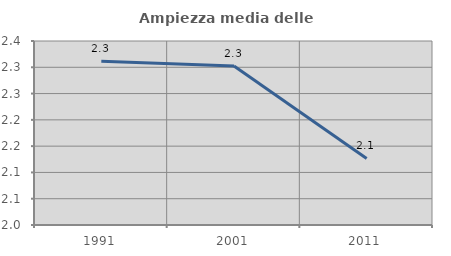
| Category | Ampiezza media delle famiglie |
|---|---|
| 1991.0 | 2.311 |
| 2001.0 | 2.303 |
| 2011.0 | 2.127 |